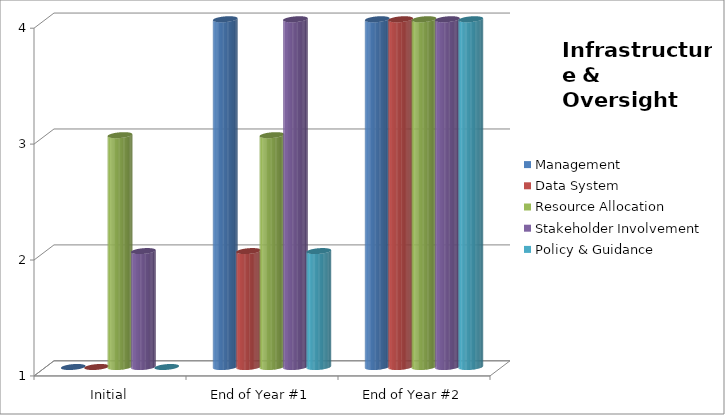
| Category | Management  | Data System  | Resource Allocation  | Stakeholder Involvement  | Policy & Guidance  |
|---|---|---|---|---|---|
| Initial | 1 | 1 | 3 | 2 | 1 |
| End of Year #1 | 4 | 2 | 3 | 4 | 2 |
| End of Year #2 | 4 | 4 | 4 | 4 | 4 |